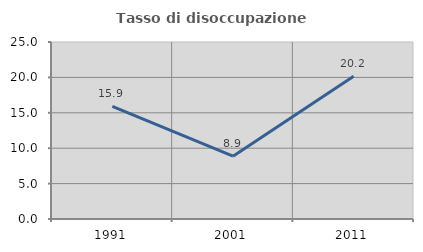
| Category | Tasso di disoccupazione giovanile  |
|---|---|
| 1991.0 | 15.918 |
| 2001.0 | 8.87 |
| 2011.0 | 20.175 |